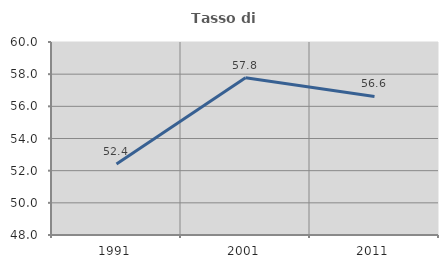
| Category | Tasso di occupazione   |
|---|---|
| 1991.0 | 52.421 |
| 2001.0 | 57.778 |
| 2011.0 | 56.612 |